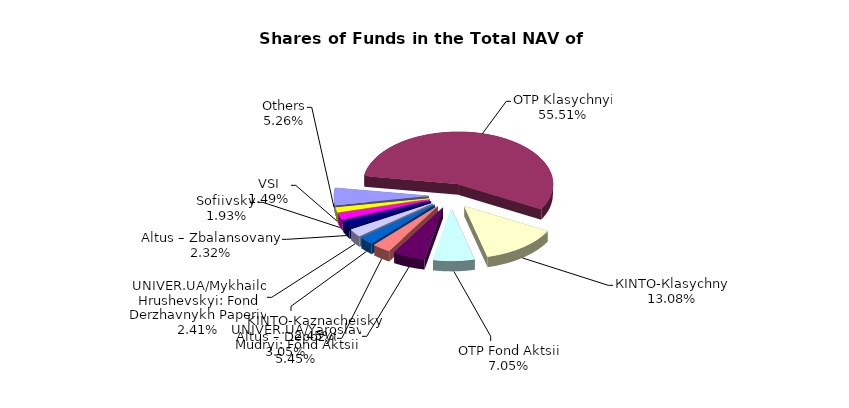
| Category | Series 0 | Series 1 |
|---|---|---|
| Others | 9319015.01 | 0.053 |
| ОТP Klasychnyi | 98441287.04 | 0.563 |
| КІNТО-Кlasychnyi | 23203593.34 | 0.133 |
| ОТP Fond Aktsii | 12495694.02 | 0.072 |
| UNIVER.UA/Yaroslav Mudryi: Fond Aktsii | 9660655.38 | 0.055 |
| Altus – Depozyt | 5415049.89 | 0.031 |
| KINTO-Kaznacheiskyi | 4353419.69 | 0.025 |
| UNIVER.UA/Мykhailo Hrushevskyi: Fond Derzhavnykh Paperiv | 4268911.13 | 0.024 |
| Altus – Zbalansovanyi | 4114610.95 | 0.024 |
| Sofiivskyi | 3425536.4 | 0.02 |
| VSI | 2635503.3 | 0.015 |